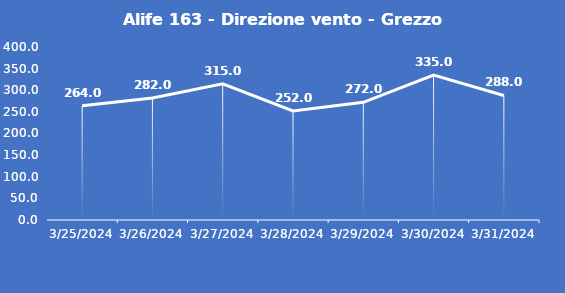
| Category | Alife 163 - Direzione vento - Grezzo (°N) |
|---|---|
| 3/25/24 | 264 |
| 3/26/24 | 282 |
| 3/27/24 | 315 |
| 3/28/24 | 252 |
| 3/29/24 | 272 |
| 3/30/24 | 335 |
| 3/31/24 | 288 |